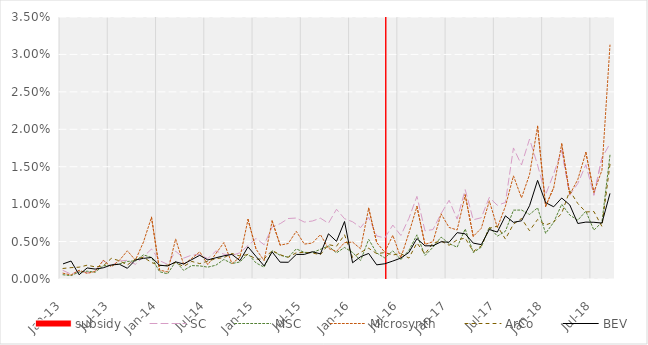
| Category | subsidy |
|---|---|
| 0 | 0 |
| 1900-01-01 | 0 |
| 1900-01-02 | 0 |
| 1900-01-03 | 0 |
| 1900-01-04 | 0 |
| 1900-01-05 | 0 |
| 1900-01-06 | 0 |
| 1900-01-07 | 0 |
| 1900-01-08 | 0 |
| 1900-01-09 | 0 |
| 1900-01-10 | 0 |
| 1900-01-11 | 0 |
| 1900-01-12 | 0 |
| 1900-01-13 | 0 |
| 1900-01-14 | 0 |
| 1900-01-15 | 0 |
| 1900-01-16 | 0 |
| 1900-01-17 | 0 |
| 1900-01-18 | 0 |
| 1900-01-19 | 0 |
| 1900-01-20 | 0 |
| 1900-01-21 | 0 |
| 1900-01-22 | 0 |
| 1900-01-23 | 0 |
| 1900-01-24 | 0 |
| 1900-01-25 | 0 |
| 1900-01-26 | 0 |
| 1900-01-27 | 0 |
| 1900-01-28 | 0 |
| 1900-01-29 | 0 |
| 1900-01-30 | 0 |
| 1900-01-31 | 0 |
| 1900-02-01 | 0 |
| 1900-02-02 | 0 |
| 1900-02-03 | 0 |
| 1900-02-04 | 0 |
| 1900-02-05 | 0 |
| 1900-02-06 | 0 |
| 1900-02-07 | 0 |
| 1900-02-08 | 0 |
| 1900-02-09 | 1.5 |
| 1900-02-10 | 0 |
| 1900-02-11 | 0 |
| 1900-02-12 | 0 |
| 1900-02-13 | 0 |
| 1900-02-14 | 0 |
| 1900-02-15 | 0 |
| 1900-02-16 | 0 |
| 1900-02-17 | 0 |
| 1900-02-18 | 0 |
| 1900-02-19 | 0 |
| 1900-02-20 | 0 |
| 1900-02-21 | 0 |
| 1900-02-22 | 0 |
| 1900-02-23 | 0 |
| 1900-02-24 | 0 |
| 1900-02-25 | 0 |
| 1900-02-26 | 0 |
| 1900-02-27 | 0 |
| 1900-02-28 | 0 |
| 1900-02-28 | 0 |
| 1900-03-01 | 0 |
| 1900-03-02 | 0 |
| 1900-03-03 | 0 |
| 1900-03-04 | 0 |